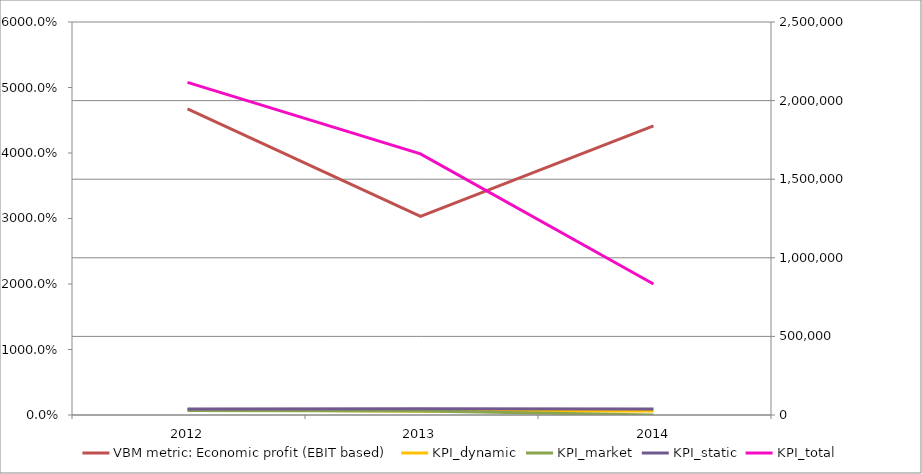
| Category | VBM metric: Economic profit (EBIT based) |
|---|---|
| 2014.0 | 1839370.074 |
| 2013.0 | 1263667.755 |
| 2012.0 | 1947922.845 |